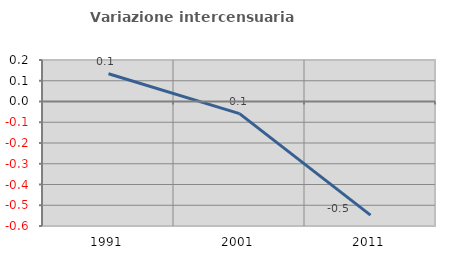
| Category | Variazione intercensuaria annua |
|---|---|
| 1991.0 | 0.134 |
| 2001.0 | -0.058 |
| 2011.0 | -0.548 |